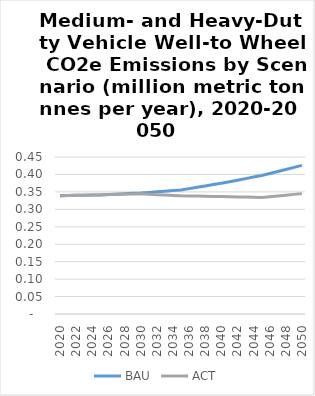
| Category | BAU | ACT |
|---|---|---|
| 2020.0 | 0.339 | 0.339 |
| 2021.0 | 0.34 | 0.34 |
| 2022.0 | 0.34 | 0.34 |
| 2023.0 | 0.34 | 0.34 |
| 2024.0 | 0.341 | 0.341 |
| 2025.0 | 0.341 | 0.341 |
| 2026.0 | 0.342 | 0.342 |
| 2027.0 | 0.344 | 0.343 |
| 2028.0 | 0.345 | 0.343 |
| 2029.0 | 0.346 | 0.344 |
| 2030.0 | 0.347 | 0.344 |
| 2031.0 | 0.349 | 0.343 |
| 2032.0 | 0.35 | 0.342 |
| 2033.0 | 0.352 | 0.341 |
| 2034.0 | 0.354 | 0.34 |
| 2035.0 | 0.355 | 0.339 |
| 2036.0 | 0.359 | 0.338 |
| 2037.0 | 0.363 | 0.338 |
| 2038.0 | 0.367 | 0.337 |
| 2039.0 | 0.371 | 0.337 |
| 2040.0 | 0.375 | 0.336 |
| 2041.0 | 0.379 | 0.336 |
| 2042.0 | 0.384 | 0.336 |
| 2043.0 | 0.388 | 0.335 |
| 2044.0 | 0.392 | 0.335 |
| 2045.0 | 0.397 | 0.334 |
| 2046.0 | 0.403 | 0.336 |
| 2047.0 | 0.409 | 0.339 |
| 2048.0 | 0.414 | 0.341 |
| 2049.0 | 0.42 | 0.343 |
| 2050.0 | 0.426 | 0.345 |